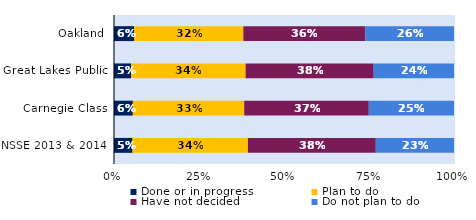
| Category | Done or in progress | Plan to do | Have not decided | Do not plan to do |
|---|---|---|---|---|
| Oakland | 0.059 | 0.321 | 0.359 | 0.261 |
| Great Lakes Public | 0.05 | 0.337 | 0.377 | 0.236 |
| Carnegie Class | 0.055 | 0.328 | 0.366 | 0.251 |
| NSSE 2013 & 2014 | 0.054 | 0.339 | 0.376 | 0.23 |